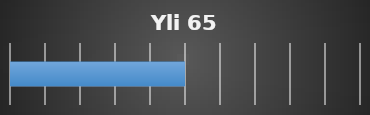
| Category | Series 0 |
|---|---|
| 0 | 50 |